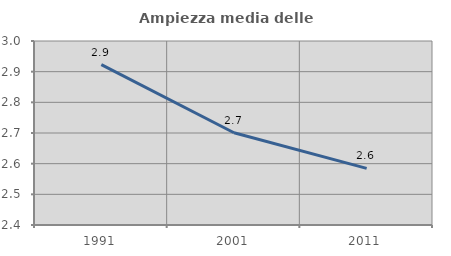
| Category | Ampiezza media delle famiglie |
|---|---|
| 1991.0 | 2.923 |
| 2001.0 | 2.701 |
| 2011.0 | 2.585 |